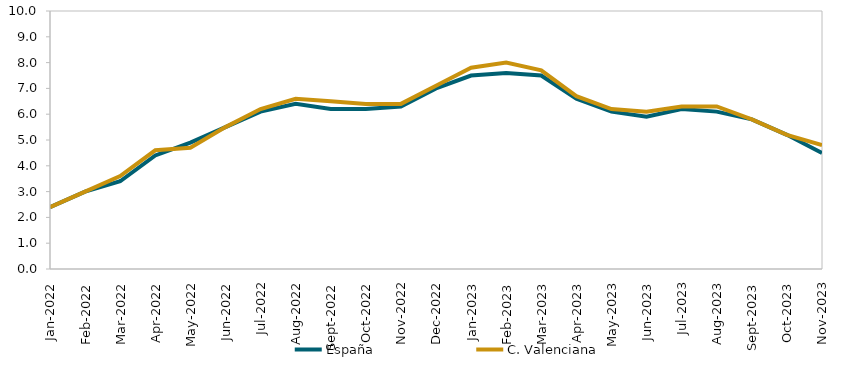
| Category | España | C. Valenciana |
|---|---|---|
| 2022-01-01 | 2.4 | 2.4 |
| 2022-02-01 | 3 | 3 |
| 2022-03-01 | 3.4 | 3.6 |
| 2022-04-01 | 4.4 | 4.6 |
| 2022-05-01 | 4.9 | 4.7 |
| 2022-06-01 | 5.5 | 5.5 |
| 2022-07-01 | 6.1 | 6.2 |
| 2022-08-01 | 6.4 | 6.6 |
| 2022-09-01 | 6.2 | 6.5 |
| 2022-10-01 | 6.2 | 6.4 |
| 2022-11-01 | 6.3 | 6.4 |
| 2022-12-01 | 7 | 7.1 |
| 2023-01-01 | 7.5 | 7.8 |
| 2023-02-01 | 7.6 | 8 |
| 2023-03-01 | 7.5 | 7.7 |
| 2023-04-01 | 6.6 | 6.7 |
| 2023-05-01 | 6.1 | 6.2 |
| 2023-06-01 | 5.9 | 6.1 |
| 2023-07-01 | 6.2 | 6.3 |
| 2023-08-01 | 6.1 | 6.3 |
| 2023-09-01 | 5.8 | 5.8 |
| 2023-10-01 | 5.2 | 5.2 |
| 2023-11-01 | 4.5 | 4.8 |